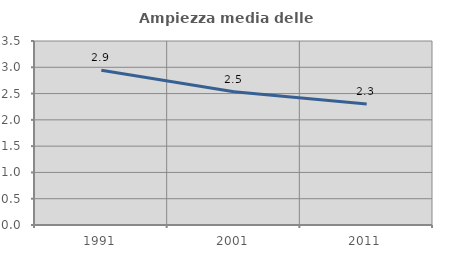
| Category | Ampiezza media delle famiglie |
|---|---|
| 1991.0 | 2.944 |
| 2001.0 | 2.535 |
| 2011.0 | 2.302 |